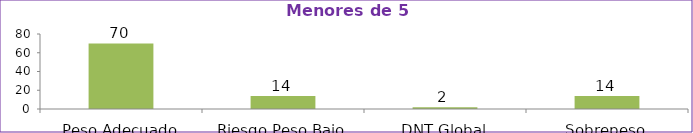
| Category | Series 0 |
|---|---|
| Peso Adecuado | 70 |
| Riesgo Peso Bajo | 14 |
| DNT Global | 2 |
| Sobrepeso | 14 |